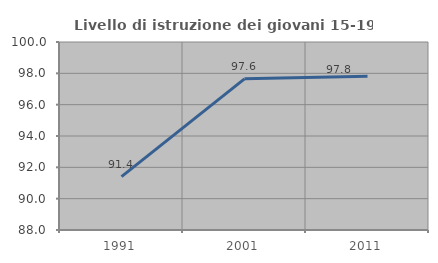
| Category | Livello di istruzione dei giovani 15-19 anni |
|---|---|
| 1991.0 | 91.41 |
| 2001.0 | 97.647 |
| 2011.0 | 97.81 |